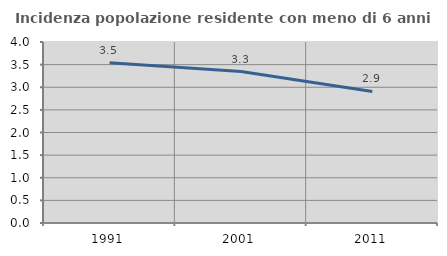
| Category | Incidenza popolazione residente con meno di 6 anni |
|---|---|
| 1991.0 | 3.542 |
| 2001.0 | 3.346 |
| 2011.0 | 2.908 |